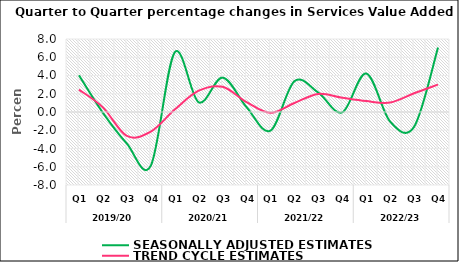
| Category | SEASONALLY ADJUSTED ESTIMATES | TREND CYCLE ESTIMATES |
|---|---|---|
| 0 | 4.022 | 2.451 |
| 1 | -0.089 | 0.507 |
| 2 | -3.459 | -2.627 |
| 3 | -5.893 | -2.155 |
| 4 | 6.539 | 0.263 |
| 5 | 1.063 | 2.332 |
| 6 | 3.767 | 2.757 |
| 7 | 0.535 | 1.084 |
| 8 | -2.043 | -0.091 |
| 9 | 3.374 | 0.986 |
| 10 | 2.118 | 1.979 |
| 11 | -0.036 | 1.56 |
| 12 | 4.22 | 1.193 |
| 13 | -1.055 | 1.029 |
| 14 | -1.624 | 2.05 |
| 15 | 7.062 | 3.003 |